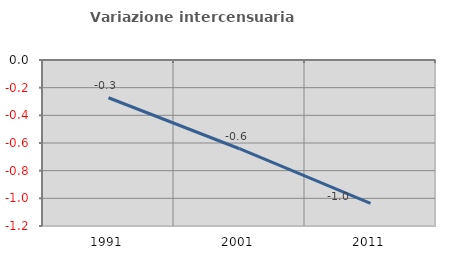
| Category | Variazione intercensuaria annua |
|---|---|
| 1991.0 | -0.273 |
| 2001.0 | -0.641 |
| 2011.0 | -1.037 |